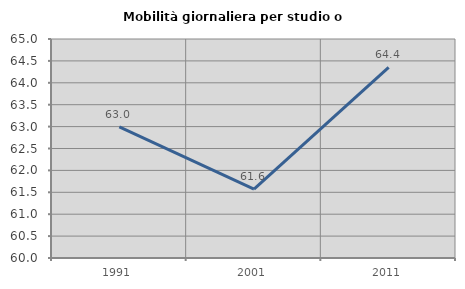
| Category | Mobilità giornaliera per studio o lavoro |
|---|---|
| 1991.0 | 62.994 |
| 2001.0 | 61.571 |
| 2011.0 | 64.351 |